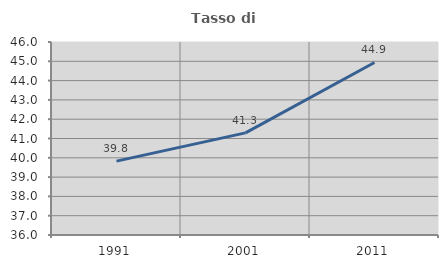
| Category | Tasso di occupazione   |
|---|---|
| 1991.0 | 39.827 |
| 2001.0 | 41.293 |
| 2011.0 | 44.938 |